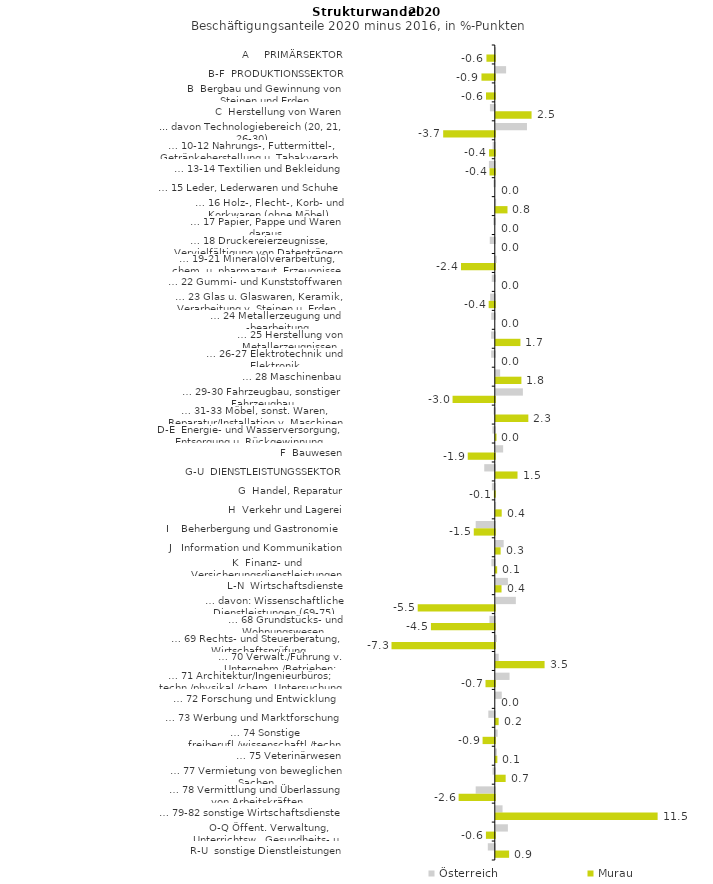
| Category | Österreich | Murau |
|---|---|---|
| A     PRIMÄRSEKTOR | 0.018 | -0.595 |
| B-F  PRODUKTIONSSEKTOR | 0.731 | -0.947 |
| B  Bergbau und Gewinnung von Steinen und Erden | -0.006 | -0.624 |
| C  Herstellung von Waren | -0.347 | 2.541 |
| ... davon Technologiebereich (20, 21, 26-30) | 2.213 | -3.666 |
| … 10-12 Nahrungs-, Futtermittel-, Getränkeherstellung u. Tabakverarb. | -0.156 | -0.408 |
| … 13-14 Textilien und Bekleidung | -0.417 | -0.375 |
| … 15 Leder, Lederwaren und Schuhe | -0.095 | 0 |
| … 16 Holz-, Flecht-, Korb- und Korkwaren (ohne Möbel)  | 0.023 | 0.83 |
| … 17 Papier, Pappe und Waren daraus  | -0.11 | 0 |
| … 18 Druckereierzeugnisse, Vervielfältigung von Datenträgern | -0.357 | 0 |
| … 19-21 Mineralölverarbeitung, chem. u. pharmazeut. Erzeugnisse | 0.063 | -2.4 |
| … 22 Gummi- und Kunststoffwaren | -0.217 | 0 |
| … 23 Glas u. Glaswaren, Keramik, Verarbeitung v. Steinen u. Erden  | -0.33 | -0.435 |
| … 24 Metallerzeugung und -bearbeitung | -0.251 | 0 |
| … 25 Herstellung von Metallerzeugnissen  | -0.261 | 1.748 |
| … 26-27 Elektrotechnik und Elektronik | -0.258 | 0 |
| … 28 Maschinenbau | 0.309 | 1.818 |
| … 29-30 Fahrzeugbau, sonstiger Fahrzeugbau | 1.924 | -3 |
| … 31-33 Möbel, sonst. Waren, Reparatur/Installation v. Maschinen | -0.089 | 2.311 |
| D-E  Energie- und Wasserversorgung, Entsorgung u. Rückgewinnung | -0.17 | 0.05 |
| F  Bauwesen | 0.522 | -1.922 |
| G-U  DIENSTLEISTUNGSSEKTOR | -0.749 | 1.542 |
| G  Handel, Reparatur | -0.208 | -0.066 |
| H  Verkehr und Lagerei | 0.02 | 0.42 |
| I    Beherbergung und Gastronomie | -1.357 | -1.493 |
| J   Information und Kommunikation | 0.559 | 0.344 |
| K  Finanz- und Versicherungsdienstleistungen | -0.241 | 0.097 |
| L-N  Wirtschaftsdienste | 0.862 | 0.407 |
| … davon: Wissenschaftliche Dienstleistungen (69-75) | 1.424 | -5.475 |
| … 68 Grundstücks- und Wohnungswesen  | -0.382 | -4.536 |
| … 69 Rechts- und Steuerberatung, Wirtschaftsprüfung | 0.071 | -7.337 |
| … 70 Verwalt./Führung v. Unternehm./Betrieben; Unternehmensberat. | 0.205 | 3.465 |
| … 71 Architektur/Ingenieurbüros; techn./physikal./chem. Untersuchung | 0.976 | -0.66 |
| … 72 Forschung und Entwicklung  | 0.423 | 0 |
| … 73 Werbung und Marktforschung | -0.459 | 0.202 |
| … 74 Sonstige freiberufl./wissenschaftl./techn. Tätigkeiten | 0.13 | -0.868 |
| … 75 Veterinärwesen | 0.078 | 0.11 |
| … 77 Vermietung von beweglichen Sachen  | -0.163 | 0.7 |
| … 78 Vermittlung und Überlassung von Arbeitskräften | -1.357 | -2.569 |
| … 79-82 sonstige Wirtschaftsdienste | 0.479 | 11.493 |
| O-Q Öffent. Verwaltung, Unterrichtsw., Gesundheits- u. Sozialwesen | 0.859 | -0.631 |
| R-U  sonstige Dienstleistungen | -0.495 | 0.944 |